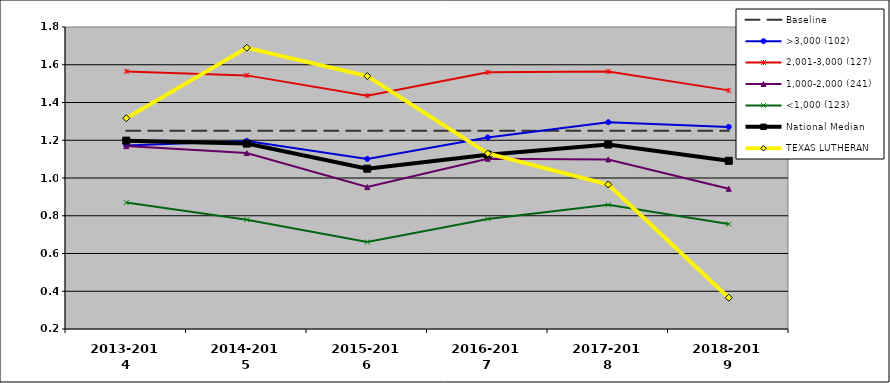
| Category |  Baseline  | >3,000 (102) | 2,001-3,000 (127) | 1,000-2,000 (241) | <1,000 (123) | National Median | TEXAS LUTHERAN |
|---|---|---|---|---|---|---|---|
| 2013-2014 | 1.25 | 1.173 | 1.565 | 1.169 | 0.87 | 1.198 | 1.317 |
| 2014-2015 | 1.25 | 1.197 | 1.544 | 1.132 | 0.779 | 1.182 | 1.69 |
| 2015-2016 | 1.25 | 1.101 | 1.436 | 0.952 | 0.661 | 1.049 | 1.54 |
| 2016-2017 | 1.25 | 1.214 | 1.56 | 1.102 | 0.783 | 1.123 | 1.13 |
| 2017-2018 | 1.25 | 1.296 | 1.564 | 1.098 | 0.858 | 1.177 | 0.966 |
| 2018-2019 | 1.25 | 1.271 | 1.464 | 0.943 | 0.756 | 1.091 | 0.366 |